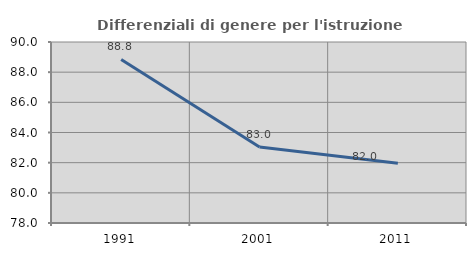
| Category | Differenziali di genere per l'istruzione superiore |
|---|---|
| 1991.0 | 88.845 |
| 2001.0 | 83.033 |
| 2011.0 | 81.969 |